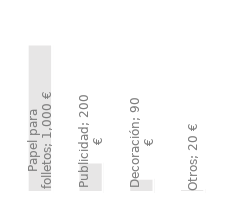
| Category | Gastos anuales |
|---|---|
| Papel para folletos | 1000 |
| Publicidad | 200 |
| Decoración | 90 |
| Otros | 20 |